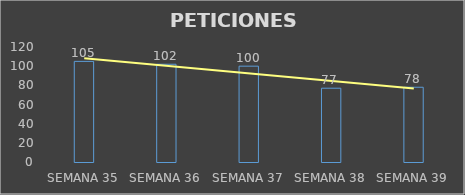
| Category | Series 0 |
|---|---|
| SEMANA 35 | 105 |
| SEMANA 36 | 102 |
| SEMANA 37 | 100 |
| SEMANA 38 | 77 |
| SEMANA 39 | 78 |